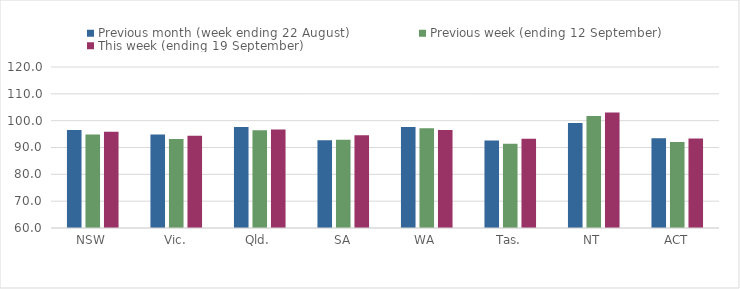
| Category | Previous month (week ending 22 August) | Previous week (ending 12 September) | This week (ending 19 September) |
|---|---|---|---|
| NSW | 96.52 | 94.88 | 95.86 |
| Vic. | 94.82 | 93.2 | 94.34 |
| Qld. | 97.67 | 96.46 | 96.7 |
| SA | 92.73 | 92.89 | 94.55 |
| WA | 97.67 | 97.21 | 96.56 |
| Tas. | 92.57 | 91.4 | 93.27 |
| NT | 99.14 | 101.72 | 103.02 |
| ACT | 93.45 | 92.03 | 93.39 |